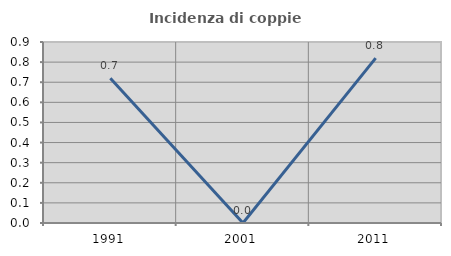
| Category | Incidenza di coppie miste |
|---|---|
| 1991.0 | 0.719 |
| 2001.0 | 0 |
| 2011.0 | 0.82 |